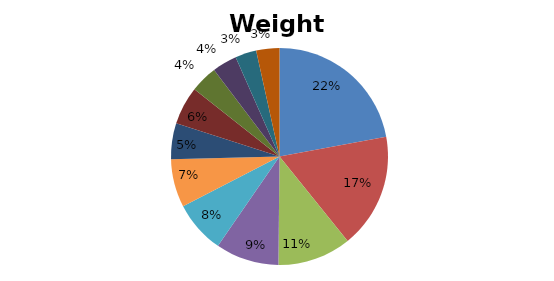
| Category | Pesos |
|---|---|
| C1 | 0.221 |
| C2 | 0.171 |
| C3 | 0.11 |
| C4 | 0.094 |
| C5 | 0.078 |
| C6 | 0.072 |
| C7 | 0.053 |
| C8 | 0.057 |
| C9 | 0.041 |
| C10 | 0.037 |
| C11 | 0.032 |
| C12 | 0.035 |